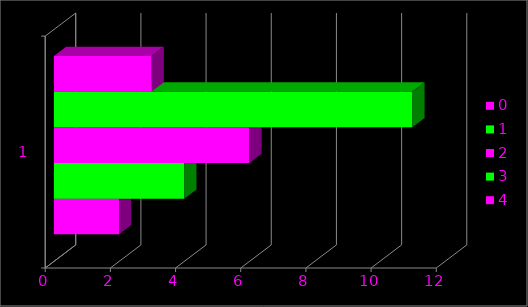
| Category | 4 | 3 | 2 | 1 | 0 |
|---|---|---|---|---|---|
| 0 | 2 | 4 | 6 | 11 | 3 |